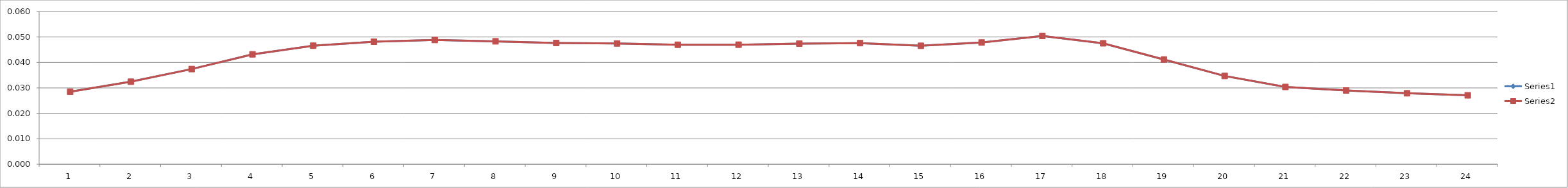
| Category | Series 0 | Series 1 |
|---|---|---|
| 0 | 0.029 | 0.029 |
| 1 | 0.032 | 0.032 |
| 2 | 0.037 | 0.037 |
| 3 | 0.043 | 0.043 |
| 4 | 0.047 | 0.047 |
| 5 | 0.048 | 0.048 |
| 6 | 0.049 | 0.049 |
| 7 | 0.048 | 0.048 |
| 8 | 0.048 | 0.048 |
| 9 | 0.047 | 0.047 |
| 10 | 0.047 | 0.047 |
| 11 | 0.047 | 0.047 |
| 12 | 0.047 | 0.047 |
| 13 | 0.048 | 0.048 |
| 14 | 0.047 | 0.047 |
| 15 | 0.048 | 0.048 |
| 16 | 0.05 | 0.05 |
| 17 | 0.048 | 0.048 |
| 18 | 0.041 | 0.041 |
| 19 | 0.035 | 0.035 |
| 20 | 0.03 | 0.03 |
| 21 | 0.029 | 0.029 |
| 22 | 0.028 | 0.028 |
| 23 | 0.027 | 0.027 |